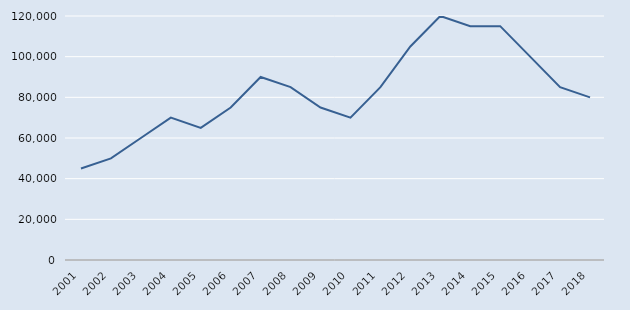
| Category | Series 1 |
|---|---|
| 2001.0 | 45000 |
| 2002.0 | 50000 |
| 2003.0 | 60000 |
| 2004.0 | 70000 |
| 2005.0 | 65000 |
| 2006.0 | 75000 |
| 2007.0 | 90000 |
| 2008.0 | 85000 |
| 2009.0 | 75000 |
| 2010.0 | 70000 |
| 2011.0 | 85000 |
| 2012.0 | 105000 |
| 2013.0 | 120000 |
| 2014.0 | 115000 |
| 2015.0 | 115000 |
| 2016.0 | 100000 |
| 2017.0 | 85000 |
| 2018.0 | 80000 |